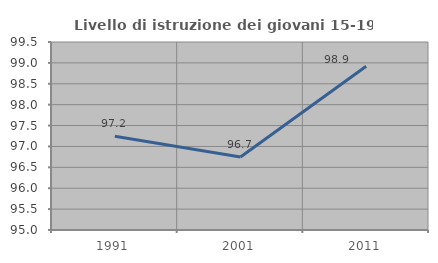
| Category | Livello di istruzione dei giovani 15-19 anni |
|---|---|
| 1991.0 | 97.244 |
| 2001.0 | 96.748 |
| 2011.0 | 98.921 |